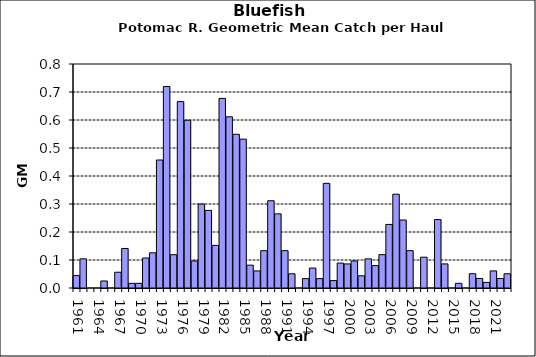
| Category | Series 0 |
|---|---|
| 1961.0 | 0.044 |
| 1962.0 | 0.104 |
| 1963.0 | 0 |
| 1964.0 | 0 |
| 1965.0 | 0.025 |
| 1966.0 | 0 |
| 1967.0 | 0.056 |
| 1968.0 | 0.141 |
| 1969.0 | 0.017 |
| 1970.0 | 0.017 |
| 1971.0 | 0.107 |
| 1972.0 | 0.126 |
| 1973.0 | 0.457 |
| 1974.0 | 0.72 |
| 1975.0 | 0.119 |
| 1976.0 | 0.666 |
| 1977.0 | 0.599 |
| 1978.0 | 0.097 |
| 1979.0 | 0.3 |
| 1980.0 | 0.277 |
| 1981.0 | 0.152 |
| 1982.0 | 0.677 |
| 1983.0 | 0.611 |
| 1984.0 | 0.549 |
| 1985.0 | 0.532 |
| 1986.0 | 0.082 |
| 1987.0 | 0.061 |
| 1988.0 | 0.133 |
| 1989.0 | 0.312 |
| 1990.0 | 0.265 |
| 1991.0 | 0.133 |
| 1992.0 | 0.051 |
| 1993.0 | 0 |
| 1994.0 | 0.034 |
| 1995.0 | 0.071 |
| 1996.0 | 0.034 |
| 1997.0 | 0.374 |
| 1998.0 | 0.027 |
| 1999.0 | 0.089 |
| 2000.0 | 0.086 |
| 2001.0 | 0.097 |
| 2002.0 | 0.044 |
| 2003.0 | 0.104 |
| 2004.0 | 0.08 |
| 2005.0 | 0.119 |
| 2006.0 | 0.227 |
| 2007.0 | 0.335 |
| 2008.0 | 0.243 |
| 2009.0 | 0.133 |
| 2010.0 | 0 |
| 2011.0 | 0.11 |
| 2012.0 | 0 |
| 2013.0 | 0.244 |
| 2014.0 | 0.086 |
| 2015.0 | 0 |
| 2016.0 | 0.017 |
| 2017.0 | 0 |
| 2018.0 | 0.051 |
| 2019.0 | 0.034 |
| 2020.0 | 0.02 |
| 2021.0 | 0.061 |
| 2022.0 | 0.034 |
| 2023.0 | 0.051 |